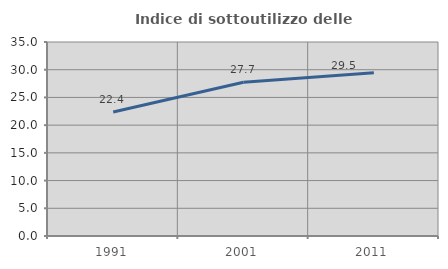
| Category | Indice di sottoutilizzo delle abitazioni  |
|---|---|
| 1991.0 | 22.377 |
| 2001.0 | 27.735 |
| 2011.0 | 29.47 |